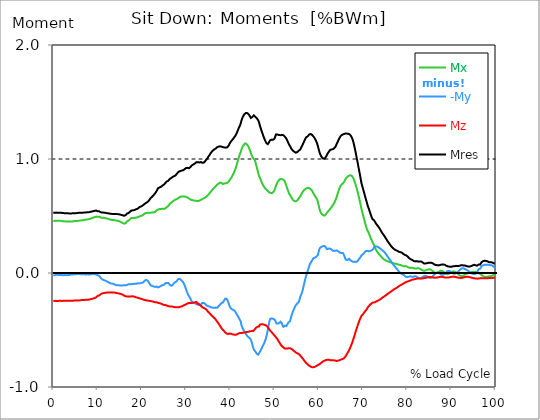
| Category |  Mx |  -My |  Mz |  Mres |
|---|---|---|---|---|
| 0.0 | 0.456 | -0.019 | -0.246 | 0.529 |
| 0.167348456675344 | 0.456 | -0.019 | -0.245 | 0.529 |
| 0.334696913350688 | 0.458 | -0.02 | -0.244 | 0.529 |
| 0.5020453700260321 | 0.458 | -0.018 | -0.244 | 0.529 |
| 0.669393826701376 | 0.458 | -0.016 | -0.245 | 0.53 |
| 0.83674228337672 | 0.458 | -0.016 | -0.245 | 0.53 |
| 1.0040907400520642 | 0.458 | -0.016 | -0.245 | 0.529 |
| 1.1621420602454444 | 0.458 | -0.017 | -0.244 | 0.529 |
| 1.3294905169207885 | 0.458 | -0.018 | -0.244 | 0.529 |
| 1.4968389735961325 | 0.458 | -0.018 | -0.244 | 0.529 |
| 1.6641874302714765 | 0.458 | -0.017 | -0.244 | 0.529 |
| 1.8315358869468206 | 0.455 | -0.017 | -0.245 | 0.528 |
| 1.9988843436221646 | 0.454 | -0.018 | -0.245 | 0.527 |
| 2.1662328002975086 | 0.454 | -0.019 | -0.244 | 0.527 |
| 2.333581256972853 | 0.454 | -0.02 | -0.243 | 0.525 |
| 2.5009297136481967 | 0.453 | -0.018 | -0.244 | 0.525 |
| 2.6682781703235405 | 0.452 | -0.017 | -0.244 | 0.524 |
| 2.8356266269988843 | 0.452 | -0.018 | -0.244 | 0.524 |
| 3.002975083674229 | 0.452 | -0.019 | -0.244 | 0.524 |
| 3.1703235403495724 | 0.452 | -0.019 | -0.244 | 0.524 |
| 3.337671997024917 | 0.452 | -0.018 | -0.244 | 0.523 |
| 3.4957233172182973 | 0.451 | -0.017 | -0.244 | 0.523 |
| 3.663071773893641 | 0.452 | -0.017 | -0.243 | 0.522 |
| 3.8304202305689854 | 0.451 | -0.016 | -0.243 | 0.522 |
| 3.997768687244329 | 0.451 | -0.014 | -0.243 | 0.522 |
| 4.165117143919673 | 0.451 | -0.013 | -0.243 | 0.522 |
| 4.332465600595017 | 0.452 | -0.013 | -0.243 | 0.523 |
| 4.499814057270361 | 0.454 | -0.012 | -0.242 | 0.524 |
| 4.667162513945706 | 0.454 | -0.012 | -0.242 | 0.524 |
| 4.834510970621049 | 0.455 | -0.012 | -0.241 | 0.524 |
| 5.001859427296393 | 0.456 | -0.012 | -0.241 | 0.524 |
| 5.169207883971737 | 0.456 | -0.011 | -0.24 | 0.525 |
| 5.336556340647081 | 0.456 | -0.01 | -0.24 | 0.525 |
| 5.503904797322425 | 0.458 | -0.008 | -0.241 | 0.527 |
| 5.671253253997769 | 0.459 | -0.008 | -0.241 | 0.528 |
| 5.82930457419115 | 0.46 | -0.01 | -0.24 | 0.528 |
| 5.996653030866494 | 0.46 | -0.01 | -0.24 | 0.528 |
| 6.164001487541838 | 0.461 | -0.011 | -0.239 | 0.528 |
| 6.331349944217181 | 0.462 | -0.011 | -0.238 | 0.528 |
| 6.498698400892526 | 0.462 | -0.011 | -0.238 | 0.529 |
| 6.66604685756787 | 0.463 | -0.011 | -0.238 | 0.529 |
| 6.833395314243213 | 0.464 | -0.012 | -0.238 | 0.53 |
| 7.000743770918558 | 0.466 | -0.012 | -0.237 | 0.531 |
| 7.168092227593902 | 0.467 | -0.013 | -0.236 | 0.531 |
| 7.335440684269246 | 0.468 | -0.013 | -0.235 | 0.531 |
| 7.50278914094459 | 0.468 | -0.013 | -0.235 | 0.532 |
| 7.6701375976199335 | 0.47 | -0.012 | -0.235 | 0.533 |
| 7.837486054295278 | 0.471 | -0.013 | -0.234 | 0.533 |
| 7.995537374488658 | 0.471 | -0.013 | -0.234 | 0.533 |
| 8.162885831164003 | 0.473 | -0.013 | -0.232 | 0.534 |
| 8.330234287839346 | 0.476 | -0.013 | -0.23 | 0.536 |
| 8.49758274451469 | 0.478 | -0.012 | -0.229 | 0.537 |
| 8.664931201190035 | 0.481 | -0.011 | -0.227 | 0.539 |
| 8.832279657865378 | 0.483 | -0.011 | -0.225 | 0.541 |
| 8.999628114540721 | 0.485 | -0.008 | -0.224 | 0.542 |
| 9.166976571216066 | 0.488 | -0.01 | -0.222 | 0.545 |
| 9.334325027891412 | 0.49 | -0.011 | -0.22 | 0.546 |
| 9.501673484566755 | 0.493 | -0.012 | -0.217 | 0.547 |
| 9.669021941242098 | 0.495 | -0.012 | -0.213 | 0.548 |
| 9.836370397917442 | 0.494 | -0.017 | -0.207 | 0.544 |
| 10.003718854592787 | 0.494 | -0.02 | -0.202 | 0.542 |
| 10.17106731126813 | 0.494 | -0.023 | -0.2 | 0.541 |
| 10.329118631461512 | 0.494 | -0.024 | -0.197 | 0.541 |
| 10.496467088136853 | 0.493 | -0.031 | -0.192 | 0.538 |
| 10.663815544812199 | 0.488 | -0.041 | -0.187 | 0.534 |
| 10.831164001487544 | 0.485 | -0.05 | -0.182 | 0.531 |
| 10.998512458162887 | 0.484 | -0.055 | -0.179 | 0.53 |
| 11.16586091483823 | 0.484 | -0.058 | -0.177 | 0.53 |
| 11.333209371513574 | 0.484 | -0.061 | -0.176 | 0.53 |
| 11.50055782818892 | 0.483 | -0.064 | -0.175 | 0.53 |
| 11.667906284864264 | 0.482 | -0.066 | -0.174 | 0.529 |
| 11.835254741539607 | 0.48 | -0.069 | -0.173 | 0.527 |
| 12.00260319821495 | 0.479 | -0.072 | -0.172 | 0.525 |
| 12.169951654890292 | 0.477 | -0.076 | -0.171 | 0.524 |
| 12.337300111565641 | 0.476 | -0.079 | -0.171 | 0.524 |
| 12.504648568240984 | 0.475 | -0.082 | -0.17 | 0.523 |
| 12.662699888434362 | 0.471 | -0.086 | -0.17 | 0.521 |
| 12.830048345109708 | 0.469 | -0.089 | -0.17 | 0.52 |
| 12.997396801785053 | 0.467 | -0.091 | -0.171 | 0.519 |
| 13.164745258460396 | 0.466 | -0.092 | -0.171 | 0.518 |
| 13.33209371513574 | 0.465 | -0.093 | -0.171 | 0.518 |
| 13.499442171811083 | 0.464 | -0.094 | -0.171 | 0.517 |
| 13.666790628486426 | 0.464 | -0.097 | -0.171 | 0.518 |
| 13.834139085161771 | 0.463 | -0.1 | -0.172 | 0.518 |
| 14.001487541837117 | 0.463 | -0.103 | -0.173 | 0.518 |
| 14.16883599851246 | 0.461 | -0.106 | -0.174 | 0.518 |
| 14.336184455187803 | 0.459 | -0.107 | -0.176 | 0.517 |
| 14.503532911863147 | 0.458 | -0.108 | -0.177 | 0.517 |
| 14.670881368538492 | 0.458 | -0.106 | -0.178 | 0.516 |
| 14.828932688731873 | 0.455 | -0.108 | -0.179 | 0.515 |
| 14.996281145407215 | 0.452 | -0.109 | -0.182 | 0.514 |
| 15.163629602082558 | 0.449 | -0.109 | -0.183 | 0.512 |
| 15.330978058757903 | 0.446 | -0.109 | -0.185 | 0.51 |
| 15.498326515433247 | 0.443 | -0.109 | -0.187 | 0.507 |
| 15.665674972108594 | 0.438 | -0.109 | -0.19 | 0.506 |
| 15.833023428783937 | 0.435 | -0.108 | -0.194 | 0.504 |
| 16.00037188545928 | 0.433 | -0.107 | -0.199 | 0.502 |
| 16.167720342134626 | 0.432 | -0.106 | -0.202 | 0.503 |
| 16.335068798809967 | 0.436 | -0.107 | -0.204 | 0.507 |
| 16.502417255485312 | 0.445 | -0.104 | -0.205 | 0.514 |
| 16.669765712160658 | 0.453 | -0.104 | -0.206 | 0.521 |
| 16.837114168836 | 0.458 | -0.101 | -0.207 | 0.524 |
| 17.004462625511344 | 0.46 | -0.099 | -0.207 | 0.527 |
| 17.16251394570472 | 0.465 | -0.098 | -0.207 | 0.531 |
| 17.32986240238007 | 0.471 | -0.098 | -0.207 | 0.537 |
| 17.497210859055414 | 0.478 | -0.097 | -0.206 | 0.544 |
| 17.664559315730756 | 0.483 | -0.098 | -0.205 | 0.549 |
| 17.8319077724061 | 0.483 | -0.098 | -0.205 | 0.55 |
| 17.999256229081443 | 0.483 | -0.097 | -0.205 | 0.55 |
| 18.166604685756788 | 0.482 | -0.093 | -0.206 | 0.549 |
| 18.333953142432133 | 0.483 | -0.094 | -0.208 | 0.552 |
| 18.501301599107478 | 0.485 | -0.096 | -0.211 | 0.556 |
| 18.668650055782823 | 0.486 | -0.096 | -0.213 | 0.559 |
| 18.835998512458165 | 0.487 | -0.092 | -0.213 | 0.561 |
| 19.00334696913351 | 0.488 | -0.09 | -0.215 | 0.563 |
| 19.170695425808855 | 0.492 | -0.09 | -0.218 | 0.567 |
| 19.338043882484197 | 0.495 | -0.091 | -0.221 | 0.573 |
| 19.496095202677576 | 0.497 | -0.092 | -0.223 | 0.579 |
| 19.66344365935292 | 0.499 | -0.09 | -0.224 | 0.582 |
| 19.830792116028263 | 0.501 | -0.088 | -0.226 | 0.585 |
| 19.998140572703612 | 0.503 | -0.086 | -0.228 | 0.587 |
| 20.165489029378953 | 0.505 | -0.085 | -0.23 | 0.591 |
| 20.3328374860543 | 0.511 | -0.082 | -0.234 | 0.597 |
| 20.500185942729644 | 0.515 | -0.073 | -0.237 | 0.601 |
| 20.667534399404985 | 0.522 | -0.067 | -0.237 | 0.607 |
| 20.83488285608033 | 0.524 | -0.064 | -0.239 | 0.611 |
| 21.002231312755672 | 0.527 | -0.061 | -0.24 | 0.616 |
| 21.16957976943102 | 0.529 | -0.061 | -0.241 | 0.618 |
| 21.336928226106362 | 0.529 | -0.068 | -0.242 | 0.624 |
| 21.504276682781704 | 0.529 | -0.076 | -0.244 | 0.631 |
| 21.67162513945705 | 0.529 | -0.087 | -0.244 | 0.639 |
| 21.82967645965043 | 0.53 | -0.098 | -0.244 | 0.648 |
| 21.997024916325774 | 0.529 | -0.108 | -0.246 | 0.657 |
| 22.16437337300112 | 0.53 | -0.116 | -0.247 | 0.666 |
| 22.33172182967646 | 0.531 | -0.114 | -0.248 | 0.669 |
| 22.499070286351806 | 0.532 | -0.113 | -0.251 | 0.674 |
| 22.666418743027148 | 0.532 | -0.118 | -0.253 | 0.683 |
| 22.833767199702496 | 0.532 | -0.122 | -0.255 | 0.69 |
| 23.00111565637784 | 0.536 | -0.122 | -0.256 | 0.699 |
| 23.168464113053183 | 0.542 | -0.121 | -0.256 | 0.708 |
| 23.335812569728528 | 0.549 | -0.119 | -0.256 | 0.717 |
| 23.50316102640387 | 0.553 | -0.123 | -0.259 | 0.73 |
| 23.670509483079215 | 0.556 | -0.126 | -0.262 | 0.743 |
| 23.83785793975456 | 0.559 | -0.124 | -0.263 | 0.749 |
| 23.995909259947936 | 0.561 | -0.121 | -0.264 | 0.751 |
| 24.163257716623285 | 0.561 | -0.117 | -0.266 | 0.753 |
| 24.330606173298627 | 0.561 | -0.111 | -0.269 | 0.756 |
| 24.49795462997397 | 0.563 | -0.107 | -0.272 | 0.759 |
| 24.665303086649313 | 0.565 | -0.107 | -0.275 | 0.766 |
| 24.83265154332466 | 0.563 | -0.105 | -0.277 | 0.772 |
| 25.0 | 0.562 | -0.104 | -0.28 | 0.776 |
| 25.167348456675345 | 0.565 | -0.1 | -0.281 | 0.782 |
| 25.334696913350694 | 0.568 | -0.089 | -0.281 | 0.79 |
| 25.502045370026035 | 0.572 | -0.085 | -0.283 | 0.797 |
| 25.669393826701377 | 0.577 | -0.087 | -0.286 | 0.804 |
| 25.836742283376722 | 0.583 | -0.086 | -0.289 | 0.807 |
| 26.004090740052067 | 0.589 | -0.087 | -0.292 | 0.81 |
| 26.17143919672741 | 0.596 | -0.092 | -0.291 | 0.813 |
| 26.329490516920792 | 0.607 | -0.103 | -0.293 | 0.826 |
| 26.49683897359613 | 0.615 | -0.108 | -0.294 | 0.831 |
| 26.66418743027148 | 0.618 | -0.111 | -0.294 | 0.833 |
| 26.831535886946828 | 0.622 | -0.113 | -0.294 | 0.839 |
| 26.998884343622166 | 0.628 | -0.105 | -0.295 | 0.844 |
| 27.166232800297514 | 0.634 | -0.093 | -0.298 | 0.846 |
| 27.333581256972852 | 0.638 | -0.086 | -0.299 | 0.849 |
| 27.5009297136482 | 0.641 | -0.081 | -0.3 | 0.854 |
| 27.668278170323543 | 0.644 | -0.079 | -0.301 | 0.858 |
| 27.835626626998888 | 0.649 | -0.075 | -0.301 | 0.866 |
| 28.002975083674233 | 0.65 | -0.064 | -0.301 | 0.875 |
| 28.170323540349575 | 0.654 | -0.056 | -0.301 | 0.882 |
| 28.33767199702492 | 0.659 | -0.052 | -0.3 | 0.889 |
| 28.50502045370026 | 0.665 | -0.051 | -0.299 | 0.892 |
| 28.663071773893645 | 0.668 | -0.054 | -0.297 | 0.894 |
| 28.830420230568986 | 0.67 | -0.058 | -0.295 | 0.896 |
| 28.99776868724433 | 0.672 | -0.066 | -0.293 | 0.898 |
| 29.165117143919673 | 0.673 | -0.073 | -0.29 | 0.9 |
| 29.33246560059502 | 0.672 | -0.08 | -0.287 | 0.901 |
| 29.499814057270367 | 0.672 | -0.094 | -0.283 | 0.906 |
| 29.66716251394571 | 0.672 | -0.106 | -0.28 | 0.91 |
| 29.834510970621054 | 0.67 | -0.123 | -0.277 | 0.913 |
| 30.00185942729639 | 0.668 | -0.144 | -0.275 | 0.921 |
| 30.169207883971744 | 0.665 | -0.161 | -0.272 | 0.924 |
| 30.33655634064708 | 0.662 | -0.177 | -0.268 | 0.923 |
| 30.50390479732243 | 0.657 | -0.193 | -0.264 | 0.92 |
| 30.671253253997772 | 0.653 | -0.203 | -0.262 | 0.919 |
| 30.829304574191156 | 0.649 | -0.211 | -0.261 | 0.921 |
| 30.996653030866494 | 0.644 | -0.226 | -0.262 | 0.93 |
| 31.164001487541842 | 0.641 | -0.241 | -0.263 | 0.938 |
| 31.331349944217187 | 0.64 | -0.253 | -0.263 | 0.945 |
| 31.498698400892525 | 0.639 | -0.258 | -0.262 | 0.949 |
| 31.666046857567874 | 0.637 | -0.262 | -0.26 | 0.952 |
| 31.833395314243212 | 0.636 | -0.266 | -0.26 | 0.958 |
| 32.00074377091856 | 0.635 | -0.264 | -0.257 | 0.961 |
| 32.1680922275939 | 0.635 | -0.268 | -0.255 | 0.965 |
| 32.33544068426925 | 0.635 | -0.274 | -0.254 | 0.971 |
| 32.50278914094459 | 0.633 | -0.277 | -0.26 | 0.972 |
| 32.670137597619934 | 0.631 | -0.278 | -0.268 | 0.972 |
| 32.83748605429528 | 0.633 | -0.273 | -0.274 | 0.97 |
| 33.004834510970625 | 0.635 | -0.271 | -0.279 | 0.969 |
| 33.162885831164004 | 0.638 | -0.273 | -0.285 | 0.97 |
| 33.33023428783935 | 0.641 | -0.28 | -0.287 | 0.973 |
| 33.497582744514695 | 0.645 | -0.274 | -0.293 | 0.971 |
| 33.664931201190036 | 0.649 | -0.263 | -0.299 | 0.967 |
| 33.83227965786538 | 0.652 | -0.263 | -0.303 | 0.968 |
| 33.99962811454073 | 0.655 | -0.262 | -0.307 | 0.968 |
| 34.16697657121607 | 0.658 | -0.265 | -0.31 | 0.973 |
| 34.33432502789141 | 0.661 | -0.272 | -0.313 | 0.981 |
| 34.50167348456676 | 0.667 | -0.279 | -0.318 | 0.99 |
| 34.6690219412421 | 0.672 | -0.285 | -0.324 | 0.999 |
| 34.83637039791744 | 0.678 | -0.287 | -0.333 | 1.006 |
| 35.00371885459279 | 0.686 | -0.291 | -0.34 | 1.018 |
| 35.17106731126814 | 0.693 | -0.292 | -0.347 | 1.025 |
| 35.338415767943474 | 0.701 | -0.295 | -0.354 | 1.036 |
| 35.49646708813686 | 0.709 | -0.298 | -0.36 | 1.047 |
| 35.6638155448122 | 0.717 | -0.3 | -0.367 | 1.056 |
| 35.831164001487544 | 0.725 | -0.303 | -0.375 | 1.065 |
| 35.998512458162885 | 0.732 | -0.304 | -0.38 | 1.072 |
| 36.165860914838234 | 0.74 | -0.304 | -0.386 | 1.079 |
| 36.333209371513576 | 0.746 | -0.305 | -0.392 | 1.083 |
| 36.50055782818892 | 0.753 | -0.306 | -0.398 | 1.086 |
| 36.667906284864266 | 0.759 | -0.306 | -0.407 | 1.091 |
| 36.83525474153961 | 0.766 | -0.308 | -0.415 | 1.097 |
| 37.002603198214956 | 0.773 | -0.306 | -0.425 | 1.102 |
| 37.1699516548903 | 0.778 | -0.299 | -0.433 | 1.105 |
| 37.337300111565646 | 0.783 | -0.293 | -0.443 | 1.108 |
| 37.50464856824098 | 0.788 | -0.29 | -0.452 | 1.11 |
| 37.66269988843437 | 0.792 | -0.279 | -0.464 | 1.111 |
| 37.83004834510971 | 0.793 | -0.272 | -0.473 | 1.111 |
| 37.99739680178505 | 0.791 | -0.263 | -0.482 | 1.108 |
| 38.16474525846039 | 0.785 | -0.261 | -0.493 | 1.107 |
| 38.33209371513574 | 0.78 | -0.259 | -0.499 | 1.104 |
| 38.49944217181109 | 0.781 | -0.251 | -0.504 | 1.104 |
| 38.666790628486424 | 0.786 | -0.237 | -0.513 | 1.101 |
| 38.83413908516178 | 0.787 | -0.225 | -0.521 | 1.098 |
| 39.001487541837115 | 0.787 | -0.223 | -0.529 | 1.1 |
| 39.16883599851246 | 0.789 | -0.225 | -0.531 | 1.1 |
| 39.336184455187805 | 0.791 | -0.239 | -0.533 | 1.103 |
| 39.503532911863154 | 0.794 | -0.252 | -0.535 | 1.107 |
| 39.670881368538495 | 0.803 | -0.27 | -0.534 | 1.119 |
| 39.83822982521384 | 0.814 | -0.29 | -0.531 | 1.135 |
| 39.996281145407224 | 0.823 | -0.303 | -0.531 | 1.144 |
| 40.163629602082565 | 0.832 | -0.311 | -0.533 | 1.154 |
| 40.33097805875791 | 0.843 | -0.317 | -0.536 | 1.162 |
| 40.498326515433256 | 0.855 | -0.32 | -0.538 | 1.17 |
| 40.6656749721086 | 0.867 | -0.324 | -0.538 | 1.177 |
| 40.83302342878393 | 0.882 | -0.33 | -0.54 | 1.187 |
| 41.00037188545929 | 0.896 | -0.332 | -0.541 | 1.194 |
| 41.16772034213463 | 0.913 | -0.341 | -0.542 | 1.205 |
| 41.33506879880997 | 0.933 | -0.352 | -0.54 | 1.217 |
| 41.50241725548531 | 0.955 | -0.364 | -0.538 | 1.23 |
| 41.66976571216066 | 0.979 | -0.376 | -0.534 | 1.247 |
| 41.837114168836 | 1.002 | -0.386 | -0.531 | 1.263 |
| 42.004462625511344 | 1.022 | -0.4 | -0.53 | 1.279 |
| 42.17181108218669 | 1.041 | -0.406 | -0.527 | 1.292 |
| 42.32986240238007 | 1.059 | -0.421 | -0.525 | 1.309 |
| 42.497210859055414 | 1.08 | -0.453 | -0.527 | 1.332 |
| 42.66455931573076 | 1.099 | -0.471 | -0.524 | 1.354 |
| 42.831907772406105 | 1.111 | -0.488 | -0.524 | 1.368 |
| 42.999256229081446 | 1.121 | -0.501 | -0.523 | 1.38 |
| 43.16660468575679 | 1.13 | -0.512 | -0.522 | 1.392 |
| 43.33395314243214 | 1.137 | -0.52 | -0.521 | 1.4 |
| 43.50130159910748 | 1.137 | -0.533 | -0.52 | 1.403 |
| 43.66865005578282 | 1.132 | -0.544 | -0.519 | 1.404 |
| 43.83599851245817 | 1.124 | -0.553 | -0.517 | 1.402 |
| 44.00334696913351 | 1.116 | -0.559 | -0.517 | 1.399 |
| 44.17069542580886 | 1.103 | -0.565 | -0.515 | 1.392 |
| 44.3380438824842 | 1.089 | -0.57 | -0.513 | 1.382 |
| 44.49609520267758 | 1.071 | -0.575 | -0.511 | 1.37 |
| 44.66344365935292 | 1.051 | -0.581 | -0.51 | 1.36 |
| 44.83079211602827 | 1.035 | -0.603 | -0.51 | 1.363 |
| 44.99814057270361 | 1.021 | -0.628 | -0.51 | 1.369 |
| 45.16548902937895 | 1.006 | -0.654 | -0.508 | 1.378 |
| 45.332837486054295 | 1.001 | -0.671 | -0.503 | 1.383 |
| 45.500185942729644 | 0.992 | -0.68 | -0.497 | 1.38 |
| 45.66753439940499 | 0.976 | -0.687 | -0.488 | 1.369 |
| 45.83488285608033 | 0.951 | -0.697 | -0.48 | 1.363 |
| 46.00223131275568 | 0.926 | -0.71 | -0.471 | 1.357 |
| 46.16957976943102 | 0.9 | -0.714 | -0.471 | 1.348 |
| 46.336928226106366 | 0.876 | -0.717 | -0.47 | 1.339 |
| 46.50427668278171 | 0.851 | -0.71 | -0.469 | 1.322 |
| 46.671625139457056 | 0.844 | -0.693 | -0.453 | 1.297 |
| 46.829676459650436 | 0.824 | -0.682 | -0.45 | 1.276 |
| 46.99702491632577 | 0.806 | -0.669 | -0.45 | 1.256 |
| 47.16437337300112 | 0.79 | -0.656 | -0.45 | 1.237 |
| 47.33172182967646 | 0.777 | -0.64 | -0.45 | 1.218 |
| 47.49907028635181 | 0.765 | -0.627 | -0.451 | 1.2 |
| 47.66641874302716 | 0.755 | -0.615 | -0.453 | 1.183 |
| 47.83376719970249 | 0.745 | -0.6 | -0.455 | 1.167 |
| 48.001115656377834 | 0.739 | -0.581 | -0.458 | 1.152 |
| 48.16846411305319 | 0.731 | -0.556 | -0.462 | 1.139 |
| 48.33581256972853 | 0.724 | -0.53 | -0.468 | 1.131 |
| 48.50316102640387 | 0.72 | -0.497 | -0.476 | 1.131 |
| 48.67050948307921 | 0.712 | -0.46 | -0.485 | 1.137 |
| 48.837857939754564 | 0.706 | -0.428 | -0.495 | 1.152 |
| 49.005206396429905 | 0.702 | -0.403 | -0.504 | 1.165 |
| 49.163257716623285 | 0.703 | -0.398 | -0.512 | 1.167 |
| 49.33060617329863 | 0.701 | -0.398 | -0.518 | 1.17 |
| 49.49795462997397 | 0.703 | -0.399 | -0.525 | 1.17 |
| 49.66530308664932 | 0.709 | -0.401 | -0.533 | 1.169 |
| 49.832651543324666 | 0.715 | -0.41 | -0.539 | 1.175 |
| 50.0 | 0.726 | -0.408 | -0.549 | 1.178 |
| 50.16734845667534 | 0.744 | -0.418 | -0.556 | 1.195 |
| 50.33469691335069 | 0.765 | -0.434 | -0.564 | 1.215 |
| 50.50204537002604 | 0.78 | -0.444 | -0.572 | 1.221 |
| 50.66939382670139 | 0.795 | -0.445 | -0.581 | 1.215 |
| 50.836742283376715 | 0.807 | -0.443 | -0.592 | 1.213 |
| 51.00409074005207 | 0.812 | -0.446 | -0.6 | 1.21 |
| 51.17143919672741 | 0.822 | -0.437 | -0.613 | 1.212 |
| 51.32949051692079 | 0.825 | -0.428 | -0.624 | 1.209 |
| 51.496838973596134 | 0.824 | -0.426 | -0.634 | 1.208 |
| 51.66418743027148 | 0.822 | -0.441 | -0.641 | 1.21 |
| 51.831535886946824 | 0.822 | -0.462 | -0.646 | 1.212 |
| 51.99888434362217 | 0.82 | -0.472 | -0.653 | 1.209 |
| 52.16623280029752 | 0.813 | -0.469 | -0.659 | 1.204 |
| 52.33358125697285 | 0.803 | -0.462 | -0.663 | 1.196 |
| 52.5009297136482 | 0.786 | -0.464 | -0.663 | 1.189 |
| 52.668278170323546 | 0.766 | -0.466 | -0.662 | 1.179 |
| 52.835626626998895 | 0.747 | -0.454 | -0.662 | 1.166 |
| 53.00297508367424 | 0.729 | -0.444 | -0.661 | 1.152 |
| 53.17032354034958 | 0.71 | -0.433 | -0.66 | 1.137 |
| 53.33767199702492 | 0.694 | -0.427 | -0.659 | 1.124 |
| 53.50502045370027 | 0.687 | -0.423 | -0.66 | 1.114 |
| 53.663071773893655 | 0.674 | -0.4 | -0.662 | 1.101 |
| 53.83042023056899 | 0.662 | -0.377 | -0.666 | 1.089 |
| 53.99776868724433 | 0.652 | -0.357 | -0.671 | 1.081 |
| 54.16511714391967 | 0.641 | -0.337 | -0.676 | 1.073 |
| 54.33246560059503 | 0.636 | -0.324 | -0.68 | 1.068 |
| 54.49981405727037 | 0.631 | -0.309 | -0.687 | 1.063 |
| 54.667162513945705 | 0.628 | -0.293 | -0.693 | 1.057 |
| 54.834510970621054 | 0.63 | -0.281 | -0.697 | 1.055 |
| 55.0018594272964 | 0.633 | -0.274 | -0.701 | 1.057 |
| 55.169207883971744 | 0.637 | -0.268 | -0.705 | 1.062 |
| 55.336556340647086 | 0.645 | -0.26 | -0.708 | 1.067 |
| 55.50390479732243 | 0.655 | -0.254 | -0.711 | 1.073 |
| 55.671253253997776 | 0.663 | -0.232 | -0.719 | 1.074 |
| 55.83860171067312 | 0.673 | -0.209 | -0.725 | 1.084 |
| 55.9966530308665 | 0.685 | -0.193 | -0.732 | 1.099 |
| 56.16400148754184 | 0.697 | -0.177 | -0.74 | 1.11 |
| 56.33134994421718 | 0.708 | -0.155 | -0.747 | 1.122 |
| 56.498698400892536 | 0.719 | -0.13 | -0.756 | 1.138 |
| 56.66604685756788 | 0.727 | -0.1 | -0.765 | 1.152 |
| 56.83339531424321 | 0.732 | -0.073 | -0.773 | 1.167 |
| 57.00074377091856 | 0.737 | -0.047 | -0.781 | 1.179 |
| 57.16809222759391 | 0.742 | -0.022 | -0.789 | 1.191 |
| 57.33544068426925 | 0.747 | -0.002 | -0.796 | 1.195 |
| 57.5027891409446 | 0.748 | 0.017 | -0.8 | 1.199 |
| 57.670137597619934 | 0.747 | 0.037 | -0.807 | 1.207 |
| 57.83748605429528 | 0.745 | 0.059 | -0.812 | 1.214 |
| 58.004834510970625 | 0.743 | 0.077 | -0.817 | 1.221 |
| 58.16288583116401 | 0.736 | 0.089 | -0.822 | 1.22 |
| 58.330234287839346 | 0.73 | 0.099 | -0.825 | 1.217 |
| 58.497582744514695 | 0.722 | 0.11 | -0.827 | 1.211 |
| 58.66493120119004 | 0.709 | 0.121 | -0.827 | 1.204 |
| 58.832279657865385 | 0.696 | 0.131 | -0.826 | 1.196 |
| 58.999628114540734 | 0.685 | 0.135 | -0.825 | 1.187 |
| 59.16697657121607 | 0.676 | 0.135 | -0.822 | 1.177 |
| 59.33432502789142 | 0.665 | 0.141 | -0.818 | 1.163 |
| 59.50167348456676 | 0.657 | 0.144 | -0.813 | 1.15 |
| 59.66902194124211 | 0.643 | 0.145 | -0.81 | 1.133 |
| 59.83637039791745 | 0.621 | 0.159 | -0.806 | 1.109 |
| 60.00371885459278 | 0.591 | 0.188 | -0.804 | 1.084 |
| 60.17106731126813 | 0.564 | 0.211 | -0.8 | 1.061 |
| 60.33841576794349 | 0.542 | 0.222 | -0.795 | 1.042 |
| 60.49646708813685 | 0.528 | 0.227 | -0.791 | 1.029 |
| 60.6638155448122 | 0.517 | 0.231 | -0.786 | 1.017 |
| 60.831164001487544 | 0.511 | 0.236 | -0.779 | 1.01 |
| 60.99851245816289 | 0.507 | 0.236 | -0.775 | 1.004 |
| 61.16586091483824 | 0.504 | 0.237 | -0.772 | 1.002 |
| 61.333209371513576 | 0.503 | 0.237 | -0.769 | 1.002 |
| 61.50055782818892 | 0.504 | 0.238 | -0.765 | 1.007 |
| 61.667906284864266 | 0.516 | 0.222 | -0.763 | 1.021 |
| 61.835254741539615 | 0.529 | 0.209 | -0.762 | 1.035 |
| 62.002603198214956 | 0.536 | 0.21 | -0.761 | 1.048 |
| 62.16995165489029 | 0.542 | 0.213 | -0.761 | 1.056 |
| 62.33730011156564 | 0.55 | 0.214 | -0.761 | 1.066 |
| 62.504648568240995 | 0.558 | 0.214 | -0.762 | 1.076 |
| 62.67199702491633 | 0.566 | 0.213 | -0.765 | 1.083 |
| 62.83004834510971 | 0.574 | 0.208 | -0.768 | 1.084 |
| 62.99739680178505 | 0.585 | 0.201 | -0.766 | 1.083 |
| 63.1647452584604 | 0.594 | 0.195 | -0.766 | 1.085 |
| 63.33209371513575 | 0.605 | 0.192 | -0.765 | 1.089 |
| 63.4994421718111 | 0.615 | 0.194 | -0.766 | 1.094 |
| 63.666790628486424 | 0.628 | 0.195 | -0.768 | 1.1 |
| 63.83413908516177 | 0.642 | 0.196 | -0.771 | 1.11 |
| 64.00148754183712 | 0.66 | 0.2 | -0.772 | 1.126 |
| 64.16883599851248 | 0.68 | 0.196 | -0.771 | 1.141 |
| 64.3361844551878 | 0.703 | 0.188 | -0.769 | 1.154 |
| 64.50353291186315 | 0.723 | 0.188 | -0.768 | 1.17 |
| 64.6708813685385 | 0.741 | 0.186 | -0.766 | 1.183 |
| 64.83822982521384 | 0.757 | 0.177 | -0.763 | 1.193 |
| 65.00557828188919 | 0.769 | 0.174 | -0.759 | 1.203 |
| 65.16362960208257 | 0.777 | 0.176 | -0.756 | 1.209 |
| 65.3309780587579 | 0.782 | 0.175 | -0.755 | 1.213 |
| 65.49832651543326 | 0.786 | 0.174 | -0.753 | 1.217 |
| 65.6656749721086 | 0.794 | 0.161 | -0.749 | 1.219 |
| 65.83302342878395 | 0.806 | 0.145 | -0.743 | 1.221 |
| 66.00037188545929 | 0.82 | 0.126 | -0.735 | 1.223 |
| 66.16772034213463 | 0.83 | 0.116 | -0.725 | 1.226 |
| 66.33506879880998 | 0.838 | 0.115 | -0.713 | 1.223 |
| 66.50241725548531 | 0.844 | 0.115 | -0.702 | 1.221 |
| 66.66976571216065 | 0.849 | 0.12 | -0.691 | 1.221 |
| 66.83711416883601 | 0.854 | 0.124 | -0.679 | 1.22 |
| 67.00446262551135 | 0.857 | 0.119 | -0.666 | 1.217 |
| 67.1718110821867 | 0.858 | 0.111 | -0.651 | 1.21 |
| 67.32986240238007 | 0.856 | 0.106 | -0.635 | 1.2 |
| 67.49721085905541 | 0.851 | 0.103 | -0.618 | 1.187 |
| 67.66455931573076 | 0.844 | 0.1 | -0.6 | 1.171 |
| 67.83190777240611 | 0.831 | 0.098 | -0.58 | 1.149 |
| 67.99925622908145 | 0.814 | 0.099 | -0.559 | 1.122 |
| 68.16660468575678 | 0.795 | 0.099 | -0.538 | 1.092 |
| 68.33395314243214 | 0.776 | 0.097 | -0.517 | 1.061 |
| 68.50130159910749 | 0.754 | 0.097 | -0.496 | 1.027 |
| 68.66865005578282 | 0.731 | 0.097 | -0.477 | 0.995 |
| 68.83599851245816 | 0.707 | 0.106 | -0.458 | 0.962 |
| 69.00334696913352 | 0.678 | 0.116 | -0.438 | 0.926 |
| 69.17069542580886 | 0.651 | 0.125 | -0.42 | 0.892 |
| 69.3380438824842 | 0.623 | 0.132 | -0.404 | 0.859 |
| 69.50539233915956 | 0.593 | 0.142 | -0.39 | 0.823 |
| 69.66344365935292 | 0.563 | 0.155 | -0.376 | 0.788 |
| 69.83079211602826 | 0.536 | 0.161 | -0.367 | 0.763 |
| 69.99814057270362 | 0.512 | 0.165 | -0.363 | 0.742 |
| 70.16548902937896 | 0.486 | 0.172 | -0.352 | 0.718 |
| 70.33283748605429 | 0.462 | 0.179 | -0.344 | 0.694 |
| 70.50018594272964 | 0.437 | 0.188 | -0.335 | 0.67 |
| 70.667534399405 | 0.413 | 0.193 | -0.327 | 0.646 |
| 70.83488285608033 | 0.393 | 0.195 | -0.32 | 0.624 |
| 71.00223131275568 | 0.376 | 0.194 | -0.308 | 0.601 |
| 71.16957976943102 | 0.363 | 0.19 | -0.298 | 0.581 |
| 71.33692822610637 | 0.348 | 0.19 | -0.291 | 0.563 |
| 71.50427668278171 | 0.332 | 0.192 | -0.283 | 0.544 |
| 71.67162513945706 | 0.315 | 0.195 | -0.277 | 0.523 |
| 71.8389735961324 | 0.299 | 0.197 | -0.271 | 0.504 |
| 71.99702491632577 | 0.286 | 0.199 | -0.264 | 0.486 |
| 72.16437337300113 | 0.272 | 0.202 | -0.26 | 0.472 |
| 72.33172182967647 | 0.258 | 0.21 | -0.258 | 0.465 |
| 72.49907028635181 | 0.244 | 0.224 | -0.259 | 0.463 |
| 72.66641874302715 | 0.227 | 0.232 | -0.258 | 0.454 |
| 72.8337671997025 | 0.213 | 0.234 | -0.254 | 0.442 |
| 73.00111565637783 | 0.201 | 0.234 | -0.249 | 0.43 |
| 73.16846411305319 | 0.19 | 0.232 | -0.246 | 0.423 |
| 73.33581256972853 | 0.18 | 0.23 | -0.244 | 0.415 |
| 73.50316102640387 | 0.171 | 0.226 | -0.24 | 0.406 |
| 73.67050948307921 | 0.162 | 0.223 | -0.237 | 0.396 |
| 73.83785793975457 | 0.157 | 0.217 | -0.234 | 0.386 |
| 74.00520639642991 | 0.149 | 0.211 | -0.228 | 0.375 |
| 74.16325771662328 | 0.141 | 0.206 | -0.223 | 0.363 |
| 74.33060617329863 | 0.134 | 0.2 | -0.218 | 0.351 |
| 74.49795462997398 | 0.127 | 0.195 | -0.213 | 0.343 |
| 74.66530308664932 | 0.122 | 0.191 | -0.209 | 0.334 |
| 74.83265154332466 | 0.118 | 0.185 | -0.205 | 0.325 |
| 75.00000000000001 | 0.114 | 0.177 | -0.2 | 0.315 |
| 75.16734845667534 | 0.11 | 0.168 | -0.195 | 0.305 |
| 75.3346969133507 | 0.106 | 0.159 | -0.19 | 0.294 |
| 75.50204537002605 | 0.103 | 0.15 | -0.186 | 0.283 |
| 75.66939382670138 | 0.101 | 0.14 | -0.182 | 0.274 |
| 75.83674228337672 | 0.099 | 0.131 | -0.176 | 0.264 |
| 76.00409074005208 | 0.098 | 0.12 | -0.172 | 0.256 |
| 76.17143919672742 | 0.094 | 0.113 | -0.168 | 0.246 |
| 76.33878765340276 | 0.091 | 0.104 | -0.163 | 0.238 |
| 76.49683897359614 | 0.09 | 0.093 | -0.158 | 0.229 |
| 76.66418743027148 | 0.089 | 0.083 | -0.153 | 0.223 |
| 76.83153588694682 | 0.087 | 0.075 | -0.149 | 0.217 |
| 76.99888434362218 | 0.085 | 0.068 | -0.144 | 0.211 |
| 77.16623280029752 | 0.083 | 0.059 | -0.14 | 0.206 |
| 77.33358125697285 | 0.081 | 0.051 | -0.136 | 0.202 |
| 77.5009297136482 | 0.081 | 0.042 | -0.133 | 0.2 |
| 77.66827817032356 | 0.077 | 0.036 | -0.128 | 0.196 |
| 77.83562662699889 | 0.076 | 0.029 | -0.124 | 0.193 |
| 78.00297508367423 | 0.075 | 0.019 | -0.12 | 0.19 |
| 78.17032354034959 | 0.073 | 0.013 | -0.115 | 0.186 |
| 78.33767199702493 | 0.072 | 0.006 | -0.111 | 0.185 |
| 78.50502045370027 | 0.07 | -0.001 | -0.107 | 0.183 |
| 78.67236891037561 | 0.068 | -0.007 | -0.103 | 0.18 |
| 78.83042023056899 | 0.065 | -0.011 | -0.1 | 0.177 |
| 78.99776868724433 | 0.061 | -0.013 | -0.097 | 0.172 |
| 79.16511714391969 | 0.059 | -0.016 | -0.092 | 0.167 |
| 79.33246560059503 | 0.059 | -0.02 | -0.088 | 0.162 |
| 79.49981405727036 | 0.059 | -0.027 | -0.085 | 0.158 |
| 79.66716251394571 | 0.059 | -0.033 | -0.081 | 0.156 |
| 79.83451097062107 | 0.058 | -0.035 | -0.077 | 0.154 |
| 80.00185942729641 | 0.055 | -0.035 | -0.075 | 0.149 |
| 80.16920788397174 | 0.051 | -0.033 | -0.073 | 0.142 |
| 80.33655634064709 | 0.048 | -0.033 | -0.071 | 0.135 |
| 80.50390479732243 | 0.046 | -0.031 | -0.069 | 0.128 |
| 80.67125325399778 | 0.045 | -0.029 | -0.067 | 0.123 |
| 80.83860171067312 | 0.045 | -0.03 | -0.064 | 0.12 |
| 80.99665303086651 | 0.046 | -0.033 | -0.061 | 0.117 |
| 81.16400148754184 | 0.047 | -0.037 | -0.058 | 0.114 |
| 81.3313499442172 | 0.045 | -0.034 | -0.057 | 0.11 |
| 81.49869840089255 | 0.041 | -0.03 | -0.056 | 0.105 |
| 81.66604685756786 | 0.038 | -0.029 | -0.055 | 0.103 |
| 81.83339531424322 | 0.039 | -0.032 | -0.052 | 0.102 |
| 82.00074377091858 | 0.037 | -0.03 | -0.052 | 0.105 |
| 82.16809222759392 | 0.039 | -0.033 | -0.05 | 0.104 |
| 82.33544068426926 | 0.041 | -0.038 | -0.048 | 0.102 |
| 82.50278914094459 | 0.042 | -0.044 | -0.048 | 0.1 |
| 82.67013759761994 | 0.041 | -0.046 | -0.048 | 0.1 |
| 82.83748605429528 | 0.038 | -0.046 | -0.048 | 0.102 |
| 83.00483451097062 | 0.035 | -0.046 | -0.048 | 0.103 |
| 83.17218296764597 | 0.031 | -0.044 | -0.048 | 0.102 |
| 83.33023428783935 | 0.027 | -0.04 | -0.048 | 0.098 |
| 83.4975827445147 | 0.022 | -0.035 | -0.048 | 0.092 |
| 83.66493120119004 | 0.02 | -0.03 | -0.046 | 0.086 |
| 83.83227965786537 | 0.019 | -0.025 | -0.045 | 0.083 |
| 83.99962811454073 | 0.02 | -0.024 | -0.044 | 0.083 |
| 84.16697657121607 | 0.022 | -0.025 | -0.042 | 0.084 |
| 84.33432502789142 | 0.024 | -0.027 | -0.04 | 0.085 |
| 84.50167348456677 | 0.028 | -0.03 | -0.039 | 0.086 |
| 84.6690219412421 | 0.03 | -0.033 | -0.037 | 0.088 |
| 84.83637039791745 | 0.033 | -0.037 | -0.036 | 0.09 |
| 85.0037188545928 | 0.034 | -0.041 | -0.036 | 0.09 |
| 85.17106731126813 | 0.032 | -0.044 | -0.036 | 0.089 |
| 85.33841576794349 | 0.029 | -0.041 | -0.036 | 0.089 |
| 85.50576422461883 | 0.024 | -0.038 | -0.037 | 0.089 |
| 85.66381554481221 | 0.019 | -0.034 | -0.038 | 0.087 |
| 85.83116400148755 | 0.015 | -0.028 | -0.039 | 0.084 |
| 85.99851245816289 | 0.01 | -0.02 | -0.04 | 0.08 |
| 86.16586091483823 | 0.004 | -0.013 | -0.041 | 0.074 |
| 86.33320937151358 | 0.002 | -0.006 | -0.041 | 0.071 |
| 86.50055782818893 | 0.001 | -0.001 | -0.04 | 0.07 |
| 86.66790628486427 | 0.002 | 0.001 | -0.04 | 0.069 |
| 86.83525474153961 | 0.005 | 0.003 | -0.039 | 0.068 |
| 87.00260319821496 | 0.008 | 0.002 | -0.037 | 0.067 |
| 87.16995165489031 | 0.012 | 0 | -0.036 | 0.067 |
| 87.33730011156564 | 0.015 | -0.004 | -0.035 | 0.068 |
| 87.504648568241 | 0.019 | -0.01 | -0.034 | 0.071 |
| 87.67199702491634 | 0.02 | -0.014 | -0.033 | 0.074 |
| 87.83004834510972 | 0.018 | -0.016 | -0.034 | 0.074 |
| 87.99739680178506 | 0.015 | -0.016 | -0.035 | 0.074 |
| 88.1647452584604 | 0.012 | -0.015 | -0.036 | 0.074 |
| 88.33209371513574 | 0.006 | -0.012 | -0.037 | 0.074 |
| 88.49944217181108 | 0.001 | -0.006 | -0.039 | 0.072 |
| 88.66679062848644 | -0.004 | 0 | -0.04 | 0.069 |
| 88.83413908516178 | -0.008 | 0.007 | -0.04 | 0.064 |
| 89.00148754183712 | -0.012 | 0.014 | -0.041 | 0.059 |
| 89.16883599851246 | -0.011 | 0.017 | -0.04 | 0.058 |
| 89.33618445518782 | -0.008 | 0.018 | -0.039 | 0.057 |
| 89.50353291186315 | -0.005 | 0.018 | -0.038 | 0.056 |
| 89.6708813685385 | -0.001 | 0.016 | -0.036 | 0.056 |
| 89.83822982521386 | 0.003 | 0.012 | -0.035 | 0.054 |
| 90.00557828188919 | 0.007 | 0.007 | -0.034 | 0.054 |
| 90.16362960208257 | 0.012 | 0.002 | -0.033 | 0.056 |
| 90.3309780587579 | 0.015 | -0.003 | -0.032 | 0.058 |
| 90.49832651543326 | 0.015 | -0.006 | -0.032 | 0.059 |
| 90.66567497210859 | 0.014 | -0.007 | -0.033 | 0.059 |
| 90.83302342878395 | 0.011 | -0.006 | -0.034 | 0.061 |
| 91.00037188545929 | 0.006 | -0.003 | -0.035 | 0.063 |
| 91.16772034213463 | 0.003 | 0.001 | -0.037 | 0.063 |
| 91.33506879880998 | -0.002 | 0.005 | -0.038 | 0.063 |
| 91.50241725548533 | -0.008 | 0.011 | -0.04 | 0.062 |
| 91.66976571216065 | -0.014 | 0.017 | -0.041 | 0.062 |
| 91.83711416883601 | -0.019 | 0.024 | -0.042 | 0.063 |
| 92.00446262551137 | -0.024 | 0.031 | -0.044 | 0.066 |
| 92.1718110821867 | -0.028 | 0.037 | -0.044 | 0.069 |
| 92.33915953886203 | -0.028 | 0.04 | -0.042 | 0.069 |
| 92.49721085905541 | -0.027 | 0.042 | -0.041 | 0.069 |
| 92.66455931573077 | -0.023 | 0.041 | -0.04 | 0.067 |
| 92.83190777240611 | -0.02 | 0.04 | -0.038 | 0.065 |
| 92.99925622908145 | -0.017 | 0.037 | -0.037 | 0.064 |
| 93.1666046857568 | -0.012 | 0.033 | -0.035 | 0.065 |
| 93.33395314243214 | -0.008 | 0.03 | -0.034 | 0.064 |
| 93.50130159910749 | -0.004 | 0.027 | -0.033 | 0.059 |
| 93.66865005578283 | -0.001 | 0.021 | -0.033 | 0.055 |
| 93.83599851245818 | 0 | 0.018 | -0.034 | 0.056 |
| 94.00334696913353 | 0.002 | 0.013 | -0.036 | 0.056 |
| 94.17069542580886 | 0.004 | 0.006 | -0.037 | 0.057 |
| 94.3380438824842 | 0.005 | 0.001 | -0.038 | 0.058 |
| 94.50539233915954 | 0.007 | -0.002 | -0.04 | 0.061 |
| 94.66344365935292 | 0.008 | -0.005 | -0.041 | 0.064 |
| 94.83079211602828 | 0.01 | -0.007 | -0.044 | 0.067 |
| 94.99814057270362 | 0.01 | -0.008 | -0.046 | 0.07 |
| 95.16548902937897 | 0.008 | -0.006 | -0.047 | 0.072 |
| 95.33283748605432 | 0.011 | -0.008 | -0.048 | 0.07 |
| 95.50018594272963 | 0.012 | -0.011 | -0.048 | 0.067 |
| 95.66753439940499 | 0.01 | -0.003 | -0.049 | 0.065 |
| 95.83488285608034 | 0.006 | 0.004 | -0.05 | 0.065 |
| 96.00223131275567 | 0.001 | 0.02 | -0.049 | 0.069 |
| 96.16957976943102 | -0.003 | 0.033 | -0.048 | 0.074 |
| 96.33692822610638 | -0.005 | 0.036 | -0.047 | 0.075 |
| 96.50427668278171 | -0.006 | 0.038 | -0.047 | 0.074 |
| 96.67162513945706 | -0.013 | 0.049 | -0.046 | 0.085 |
| 96.8389735961324 | -0.018 | 0.061 | -0.045 | 0.096 |
| 96.99702491632577 | -0.022 | 0.064 | -0.046 | 0.1 |
| 97.16437337300111 | -0.027 | 0.067 | -0.047 | 0.104 |
| 97.33172182967647 | -0.031 | 0.071 | -0.047 | 0.106 |
| 97.49907028635181 | -0.033 | 0.072 | -0.047 | 0.107 |
| 97.66641874302715 | -0.034 | 0.072 | -0.047 | 0.106 |
| 97.8337671997025 | -0.034 | 0.073 | -0.047 | 0.106 |
| 98.00111565637785 | -0.034 | 0.074 | -0.046 | 0.104 |
| 98.16846411305319 | -0.033 | 0.073 | -0.046 | 0.102 |
| 98.33581256972855 | -0.031 | 0.072 | -0.046 | 0.099 |
| 98.50316102640389 | -0.029 | 0.071 | -0.045 | 0.096 |
| 98.67050948307921 | -0.028 | 0.068 | -0.045 | 0.093 |
| 98.83785793975456 | -0.028 | 0.068 | -0.045 | 0.093 |
| 99.0052063964299 | -0.028 | 0.069 | -0.045 | 0.094 |
| 99.17255485310525 | -0.025 | 0.067 | -0.045 | 0.093 |
| 99.33060617329863 | -0.021 | 0.063 | -0.042 | 0.09 |
| 99.49795462997399 | -0.017 | 0.057 | -0.041 | 0.087 |
| 99.66530308664933 | -0.013 | 0.051 | -0.04 | 0.083 |
| 99.83265154332467 | -0.01 | 0.045 | -0.039 | 0.081 |
| 100.0 | -0.007 | 0.038 | -0.039 | 0.079 |